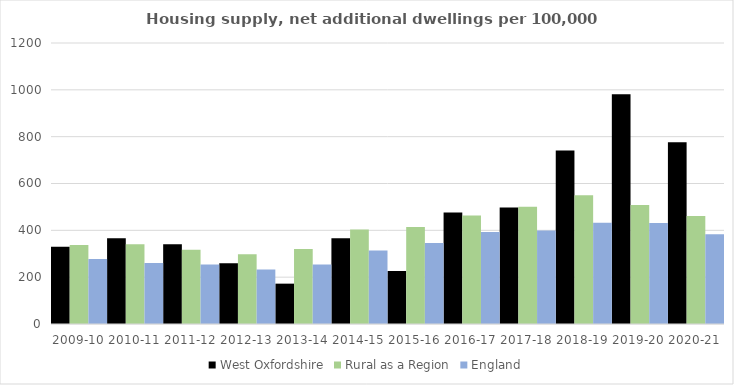
| Category | West Oxfordshire | Rural as a Region | England |
|---|---|---|---|
| 2009-10 | 330.367 | 337.852 | 277.548 |
| 2010-11 | 365.786 | 340.105 | 260.994 |
| 2011-12 | 340.472 | 317.04 | 254.007 |
| 2012-13 | 259.415 | 297.763 | 233.153 |
| 2013-14 | 172.31 | 319.835 | 253.602 |
| 2014-15 | 366.344 | 403.796 | 314.256 |
| 2015-16 | 226.501 | 414.091 | 346.154 |
| 2016-17 | 476.331 | 463.209 | 393.256 |
| 2017-18 | 497.868 | 500.68 | 399.646 |
| 2018-19 | 740.437 | 549.491 | 432.099 |
| 2019-20 | 981.535 | 508.493 | 431.187 |
| 2020-21 | 776.678 | 461.114 | 382.827 |